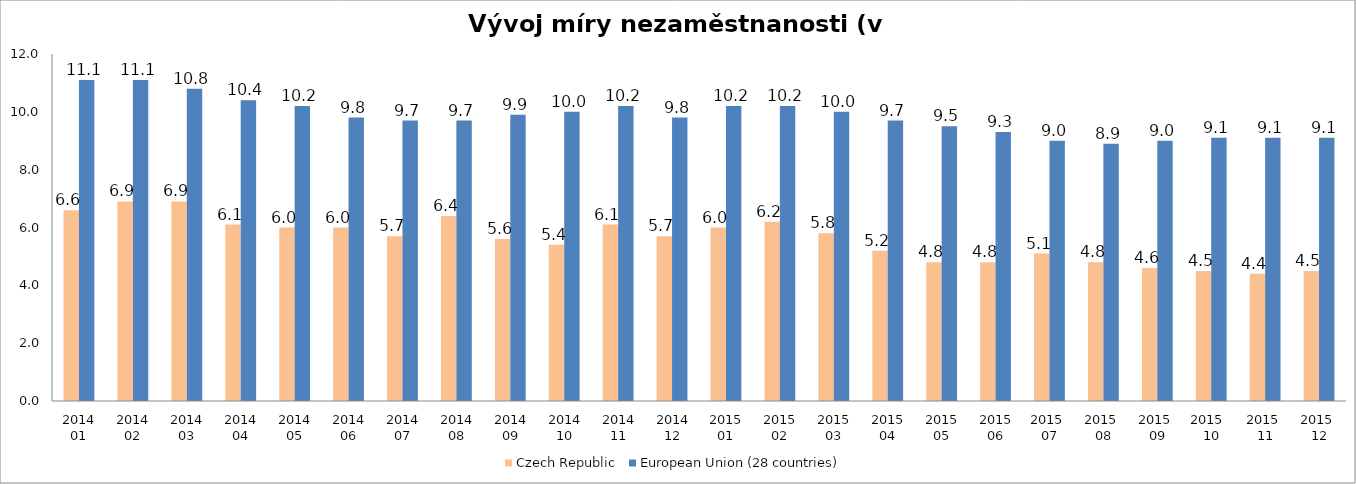
| Category | Czech Republic | European Union (28 countries) |
|---|---|---|
| 2014 01 | 6.6 | 11.1 |
| 2014 02 | 6.9 | 11.1 |
| 2014 03 | 6.9 | 10.8 |
| 2014 04 | 6.1 | 10.4 |
| 2014 05 | 6 | 10.2 |
| 2014 06 | 6 | 9.8 |
| 2014 07 | 5.7 | 9.7 |
| 2014 08 | 6.4 | 9.7 |
| 2014 09 | 5.6 | 9.9 |
| 2014 10 | 5.4 | 10 |
| 2014 11 | 6.1 | 10.2 |
| 2014 12 | 5.7 | 9.8 |
| 2015 01 | 6 | 10.2 |
| 2015 02 | 6.2 | 10.2 |
| 2015 03 | 5.8 | 10 |
| 2015 04 | 5.2 | 9.7 |
| 2015 05 | 4.8 | 9.5 |
| 2015 06 | 4.8 | 9.3 |
| 2015  07 | 5.1 | 9 |
| 2015  08 | 4.8 | 8.9 |
| 2015  09 | 4.6 | 9 |
| 2015   10 | 4.5 | 9.1 |
| 2015  11 | 4.4 | 9.1 |
| 2015  12 | 4.5 | 9.1 |